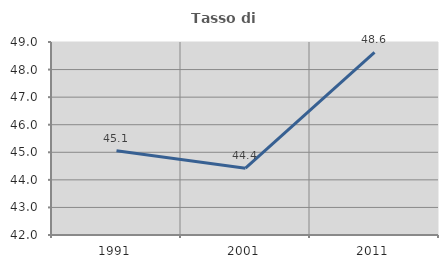
| Category | Tasso di occupazione   |
|---|---|
| 1991.0 | 45.057 |
| 2001.0 | 44.425 |
| 2011.0 | 48.623 |